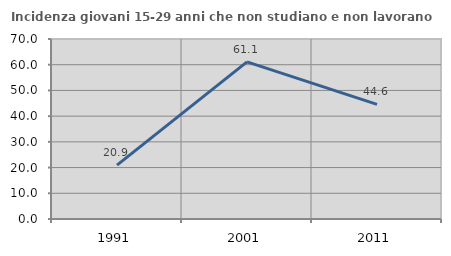
| Category | Incidenza giovani 15-29 anni che non studiano e non lavorano  |
|---|---|
| 1991.0 | 20.93 |
| 2001.0 | 61.078 |
| 2011.0 | 44.578 |